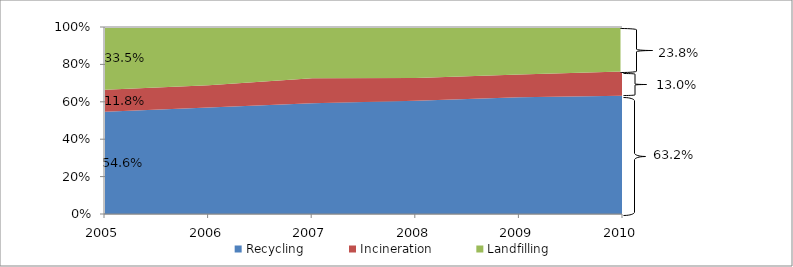
| Category | Recycling | Incineration | Landfilling |
|---|---|---|---|
| 2005.0 | 0.546 | 0.118 | 0.335 |
| 2006.0 | 0.569 | 0.12 | 0.311 |
| 2007.0 | 0.592 | 0.134 | 0.274 |
| 2008.0 | 0.605 | 0.122 | 0.272 |
| 2009.0 | 0.625 | 0.121 | 0.254 |
| 2010.0 | 0.632 | 0.13 | 0.238 |